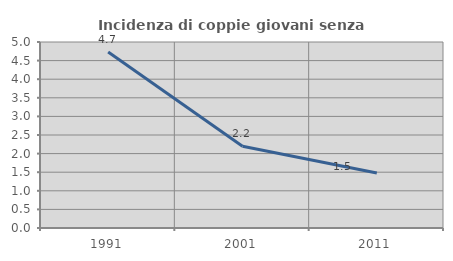
| Category | Incidenza di coppie giovani senza figli |
|---|---|
| 1991.0 | 4.733 |
| 2001.0 | 2.197 |
| 2011.0 | 1.477 |